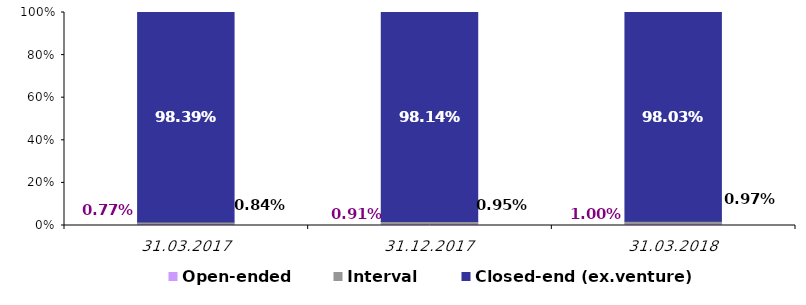
| Category | Open-ended | Interval | Closed-end (ex.venture) |
|---|---|---|---|
| 31.03.2017 | 0.008 | 0.008 | 0.984 |
| 31.12.2017 | 0.009 | 0.009 | 0.981 |
| 31.03.2018 | 0.01 | 0.01 | 0.98 |